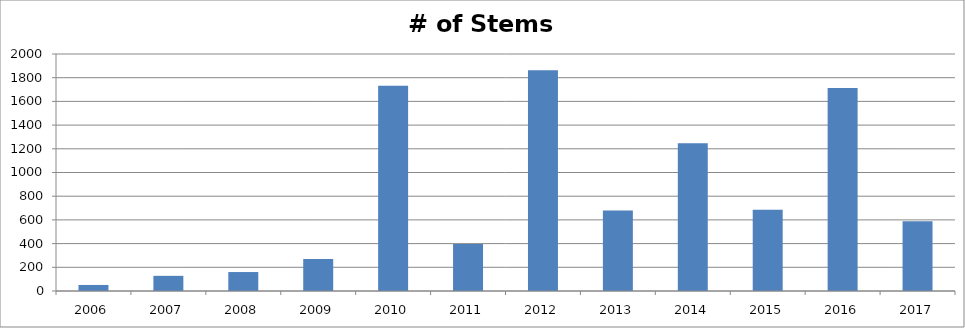
| Category | # of Stems Observed |
|---|---|
| 2006.0 | 51 |
| 2007.0 | 128 |
| 2008.0 | 160 |
| 2009.0 | 271 |
| 2010.0 | 1732 |
| 2011.0 | 397 |
| 2012.0 | 1863 |
| 2013.0 | 680 |
| 2014.0 | 1247 |
| 2015.0 | 686 |
| 2016.0 | 1714 |
| 2017.0 | 588 |